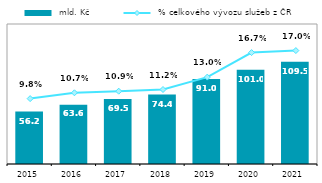
| Category |  mld. Kč |
|---|---|
| 2015.0 | 56.164 |
| 2016.0 | 63.584 |
| 2017.0 | 69.518 |
| 2018.0 | 74.364 |
| 2019.0 | 91 |
| 2020.0 | 101.013 |
| 2021.0 | 109.483 |